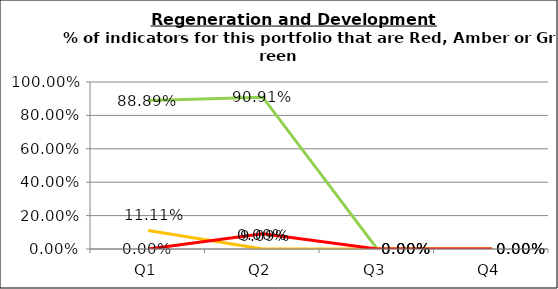
| Category | Green | Amber | Red |
|---|---|---|---|
| Q1 | 0.889 | 0.111 | 0 |
| Q2 | 0.909 | 0 | 0.091 |
| Q3 | 0 | 0 | 0 |
| Q4 | 0 | 0 | 0 |